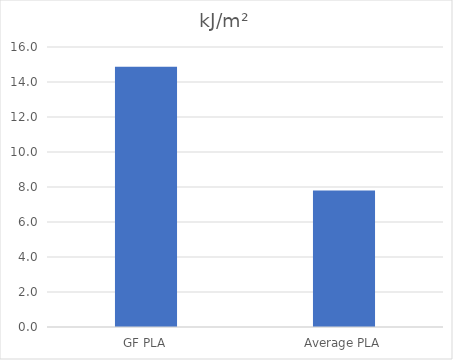
| Category | kJ/m² |
|---|---|
| GF PLA | 14.868 |
| Average PLA | 7.8 |